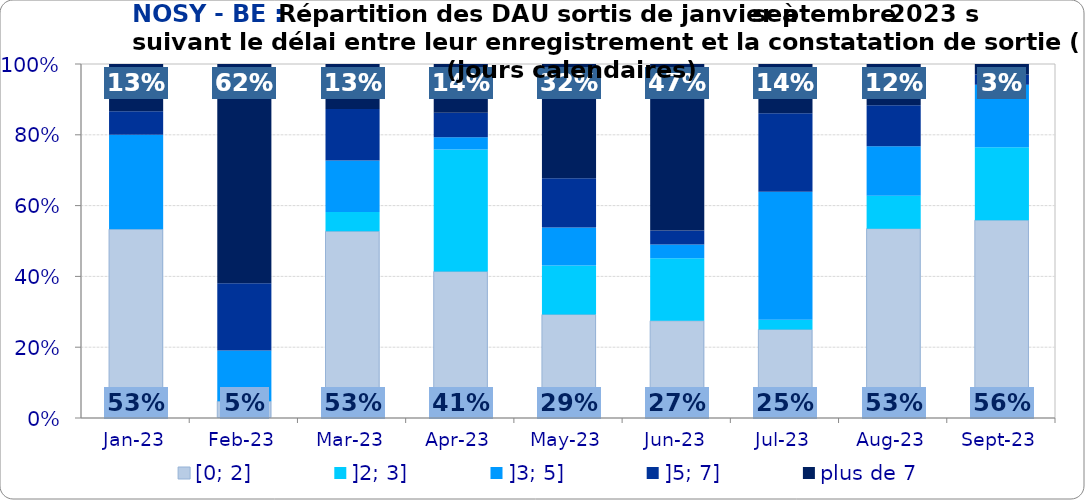
| Category | [0; 2] | ]2; 3] | ]3; 5] | ]5; 7] | plus de 7 |
|---|---|---|---|---|---|
| 2023-01-01 | 0.533 | 0 | 0.267 | 0.067 | 0.133 |
| 2023-02-01 | 0.048 | 0 | 0.143 | 0.19 | 0.619 |
| 2023-03-01 | 0.527 | 0.055 | 0.145 | 0.145 | 0.127 |
| 2023-04-01 | 0.414 | 0.345 | 0.034 | 0.069 | 0.138 |
| 2023-05-01 | 0.292 | 0.138 | 0.108 | 0.138 | 0.323 |
| 2023-06-01 | 0.275 | 0.176 | 0.039 | 0.039 | 0.471 |
| 2023-07-01 | 0.25 | 0.028 | 0.361 | 0.222 | 0.139 |
| 2023-08-01 | 0.535 | 0.093 | 0.14 | 0.116 | 0.116 |
| 2023-09-01 | 0.559 | 0.206 | 0.176 | 0.029 | 0.029 |